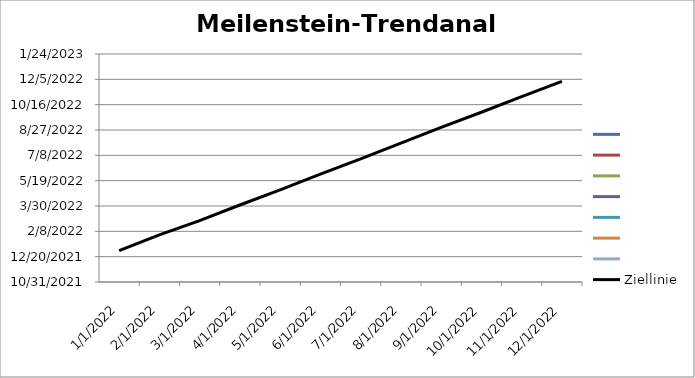
| Category | Series 0 | Series 1 | Series 2 | Series 3 | Series 4 | Series 5 | Series 6 | Ziellinie |
|---|---|---|---|---|---|---|---|---|
| 01.01.2022 |  |  |  |  |  |  |  | 1/1/22 |
| 01.02.2022 |  |  |  |  |  |  |  | 2/1/22 |
| 01.03.2022 |  |  |  |  |  |  |  | 3/1/22 |
| 01.04.2022 |  |  |  |  |  |  |  | 4/1/22 |
| 01.05.2022 |  |  |  |  |  |  |  | 5/1/22 |
| 01.06.2022 |  |  |  |  |  |  |  | 6/1/22 |
| 01.07.2022 |  |  |  |  |  |  |  | 7/1/22 |
| 01.08.2022 |  |  |  |  |  |  |  | 8/1/22 |
| 01.09.2022 |  |  |  |  |  |  |  | 9/1/22 |
| 01.10.2022 |  |  |  |  |  |  |  | 10/1/22 |
| 01.11.2022 |  |  |  |  |  |  |  | 11/1/22 |
| 01.12.2022 |  |  |  |  |  |  |  | 12/1/22 |